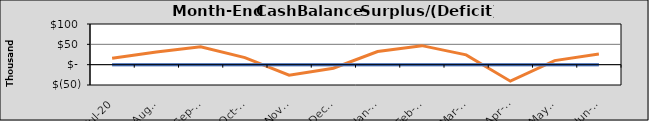
| Category | Final Cash | Original Cash | Revised Cash |
|---|---|---|---|
| 2020-07-01 | 15901.253 | 0 | 0 |
| 2020-08-01 | 31074.457 | 0 | 0 |
| 2020-09-01 | 44174.315 | 0 | 0 |
| 2020-10-02 | 17265.518 | 0 | 0 |
| 2020-11-02 | -25749.103 | 0 | 0 |
| 2020-12-03 | -8762.85 | 0 | 0 |
| 2021-01-03 | 32370.354 | 0 | 0 |
| 2021-02-03 | 46752.682 | 0 | 0 |
| 2021-03-06 | 24035.415 | 0 | 0 |
| 2021-04-06 | -40579.207 | 0 | 0 |
| 2021-05-07 | 9967.047 | 0 | 0 |
| 2021-06-07 | 26013.3 | 0 | 0 |